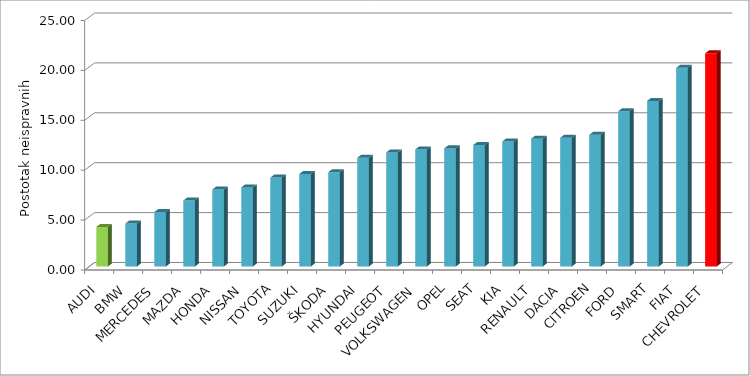
| Category | Series 4 |
|---|---|
| AUDI | 3.959 |
| BMW | 4.307 |
| MERCEDES | 5.457 |
| MAZDA | 6.608 |
| HONDA | 7.716 |
| NISSAN | 7.928 |
| TOYOTA | 8.907 |
| SUZUKI | 9.266 |
| ŠKODA | 9.451 |
| HYUNDAI | 10.899 |
| PEUGEOT | 11.431 |
| VOLKSWAGEN | 11.726 |
| OPEL | 11.836 |
| SEAT | 12.168 |
| KIA | 12.523 |
| RENAULT | 12.806 |
| DACIA | 12.897 |
| CITROEN | 13.191 |
| FORD | 15.551 |
| SMART | 16.594 |
| FIAT | 19.908 |
| CHEVROLET | 21.358 |